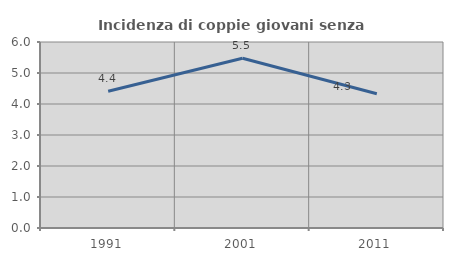
| Category | Incidenza di coppie giovani senza figli |
|---|---|
| 1991.0 | 4.412 |
| 2001.0 | 5.476 |
| 2011.0 | 4.329 |